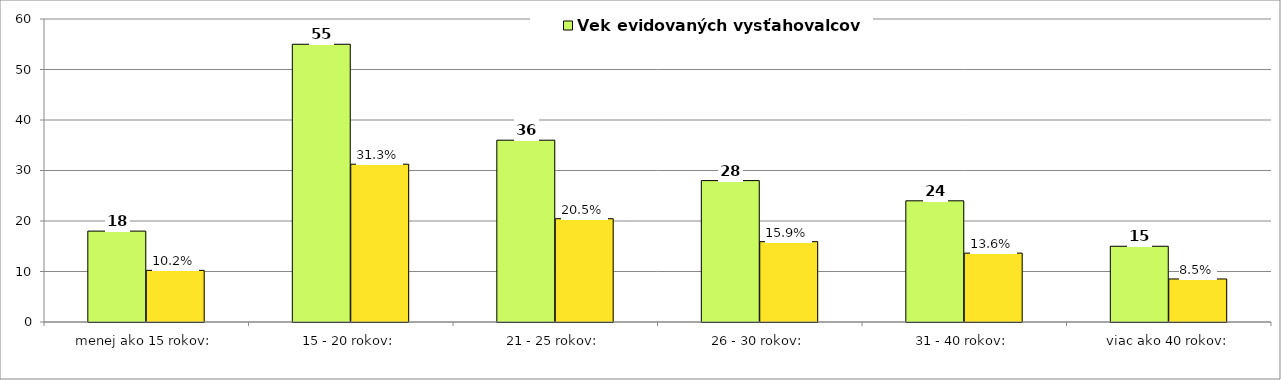
| Category | Vek evidovaných vysťahovalcov |
|---|---|
| menej ako 15 rokov: | 10.227 |
| 15 - 20 rokov: | 31.25 |
| 21 - 25 rokov: | 20.455 |
| 26 - 30 rokov: | 15.909 |
| 31 - 40 rokov: | 13.636 |
| viac ako 40 rokov: | 8.523 |